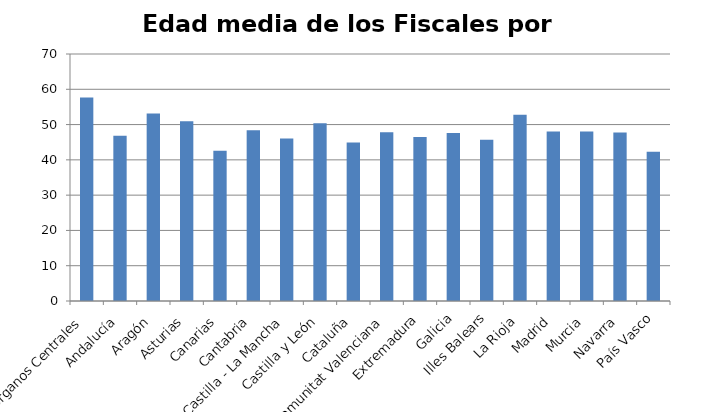
| Category | Edad Media |
|---|---|
| Órganos Centrales | 57.66 |
| Andalucía | 46.81 |
| Aragón | 53.16 |
| Asturias | 50.95 |
| Canarias | 42.56 |
| Cantabria | 48.37 |
| Castilla - La Mancha | 46.02 |
| Castilla y León | 50.4 |
| Cataluña | 44.91 |
| Comunitat Valenciana | 47.81 |
| Extremadura | 46.48 |
| Galicia | 47.61 |
| Illes Balears | 45.68 |
| La Rioja | 52.75 |
| Madrid | 48.05 |
| Murcia | 48.07 |
| Navarra | 47.72 |
| País Vasco | 42.31 |